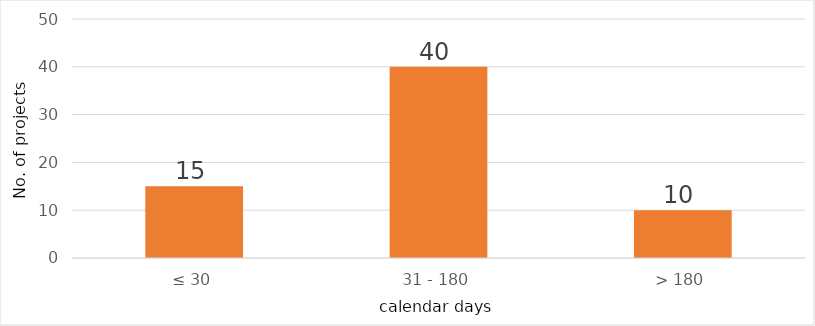
| Category | Series 0 |
|---|---|
| 0 | 15 |
| 1 | 40 |
| 2 | 10 |